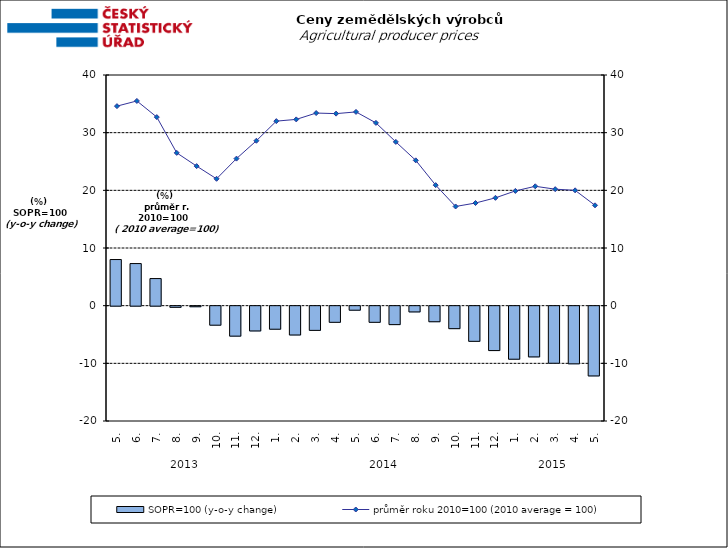
| Category | SOPR=100 (y-o-y change)   |
|---|---|
| 0 | 8 |
| 1 | 7.3 |
| 2 | 4.7 |
| 3 | -0.2 |
| 4 | -0.1 |
| 5 | -3.3 |
| 6 | -5.2 |
| 7 | -4.3 |
| 8 | -4 |
| 9 | -5 |
| 10 | -4.2 |
| 11 | -2.8 |
| 12 | -0.7 |
| 13 | -2.8 |
| 14 | -3.2 |
| 15 | -1 |
| 16 | -2.7 |
| 17 | -3.9 |
| 18 | -6.1 |
| 19 | -7.7 |
| 20 | -9.2 |
| 21 | -8.8 |
| 22 | -9.9 |
| 23 | -10 |
| 24 | -12.1 |